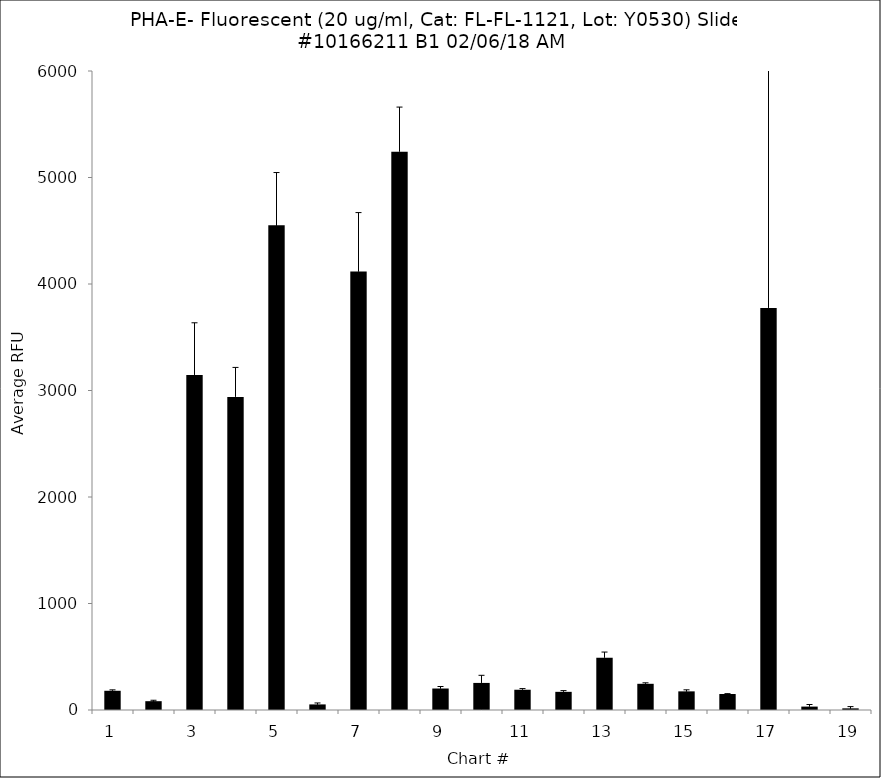
| Category | Series 0 |
|---|---|
| 1.0 | 180.5 |
| 2.0 | 82.75 |
| 3.0 | 3146 |
| 4.0 | 2940 |
| 5.0 | 4552.5 |
| 6.0 | 52.5 |
| 7.0 | 4116.25 |
| 8.0 | 5242.5 |
| 9.0 | 201.75 |
| 10.0 | 254.25 |
| 11.0 | 190.25 |
| 12.0 | 170.5 |
| 13.0 | 491 |
| 14.0 | 246 |
| 15.0 | 175 |
| 16.0 | 150 |
| 17.0 | 3775.25 |
| 18.0 | 32 |
| 19.0 | 15.5 |